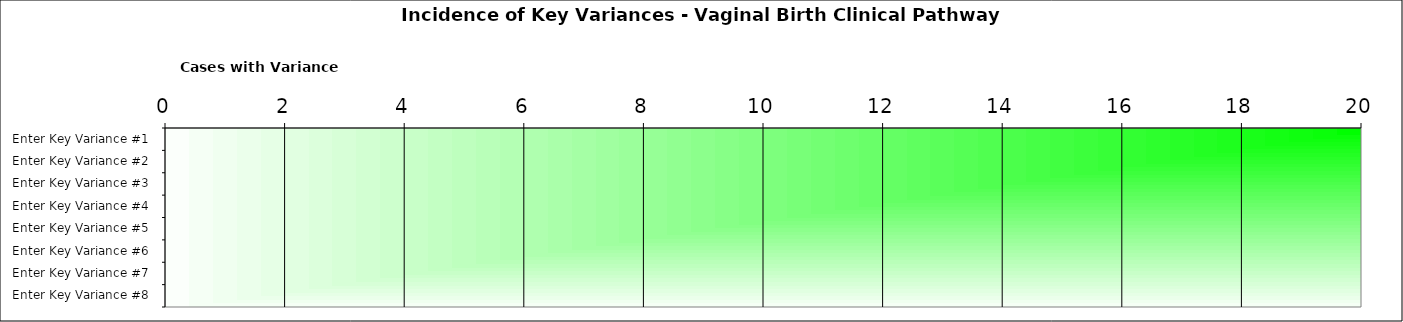
| Category | Key Variances |
|---|---|
| Enter Key Variance #1 | 0 |
| Enter Key Variance #2 | 0 |
| Enter Key Variance #3 | 0 |
| Enter Key Variance #4 | 0 |
| Enter Key Variance #5 | 0 |
| Enter Key Variance #6 | 0 |
| Enter Key Variance #7 | 0 |
| Enter Key Variance #8 | 0 |